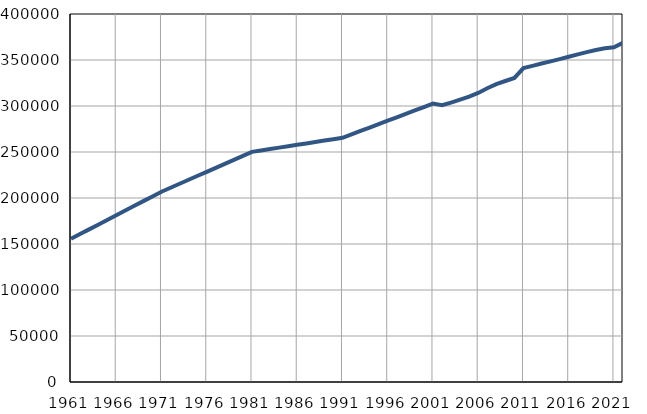
| Category | Број
становника |
|---|---|
| 1961.0 | 155685 |
| 1962.0 | 160799 |
| 1963.0 | 165912 |
| 1964.0 | 171026 |
| 1965.0 | 176139 |
| 1966.0 | 181252 |
| 1967.0 | 186367 |
| 1968.0 | 191480 |
| 1969.0 | 196594 |
| 1970.0 | 201708 |
| 1971.0 | 206821 |
| 1972.0 | 211153 |
| 1973.0 | 215484 |
| 1974.0 | 219816 |
| 1975.0 | 224147 |
| 1976.0 | 228480 |
| 1977.0 | 232811 |
| 1978.0 | 237143 |
| 1979.0 | 241475 |
| 1980.0 | 245806 |
| 1981.0 | 250138 |
| 1982.0 | 251671 |
| 1983.0 | 253204 |
| 1984.0 | 254736 |
| 1985.0 | 256268 |
| 1986.0 | 257801 |
| 1987.0 | 259334 |
| 1988.0 | 260866 |
| 1989.0 | 262399 |
| 1990.0 | 263931 |
| 1991.0 | 265464 |
| 1992.0 | 269177 |
| 1993.0 | 272890 |
| 1994.0 | 276602 |
| 1995.0 | 280315 |
| 1996.0 | 284029 |
| 1997.0 | 287741 |
| 1998.0 | 291455 |
| 1999.0 | 295167 |
| 2000.0 | 298880 |
| 2001.0 | 302593 |
| 2002.0 | 300831 |
| 2003.0 | 303745 |
| 2004.0 | 306853 |
| 2005.0 | 310185 |
| 2006.0 | 314192 |
| 2007.0 | 319259 |
| 2008.0 | 323708 |
| 2009.0 | 327175 |
| 2010.0 | 330527 |
| 2011.0 | 341228 |
| 2012.0 | 343648 |
| 2013.0 | 346163 |
| 2014.0 | 348540 |
| 2015.0 | 350930 |
| 2016.0 | 353525 |
| 2017.0 | 356126 |
| 2018.0 | 358572 |
| 2019.0 | 360925 |
| 2020.0 | 362675 |
| 2021.0 | 363789 |
| 2022.0 | 368743 |